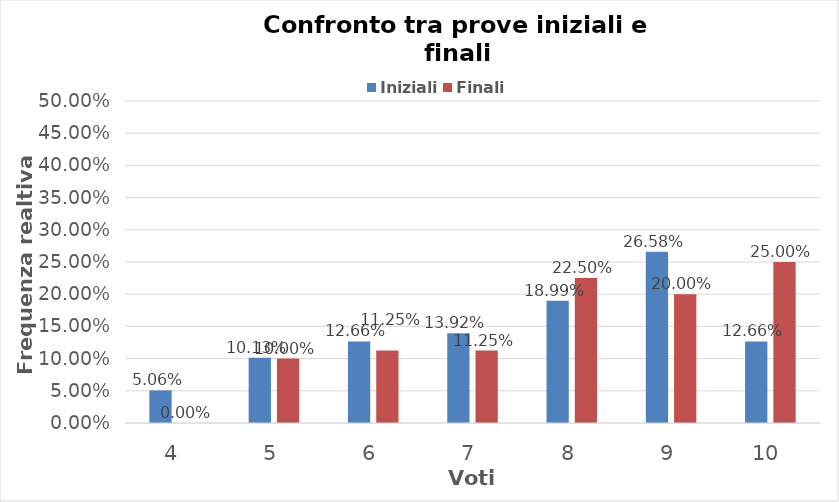
| Category | Iniziali | Finali |
|---|---|---|
| 4.0 | 0.051 | 0 |
| 5.0 | 0.101 | 0.1 |
| 6.0 | 0.127 | 0.112 |
| 7.0 | 0.139 | 0.112 |
| 8.0 | 0.19 | 0.225 |
| 9.0 | 0.266 | 0.2 |
| 10.0 | 0.127 | 0.25 |